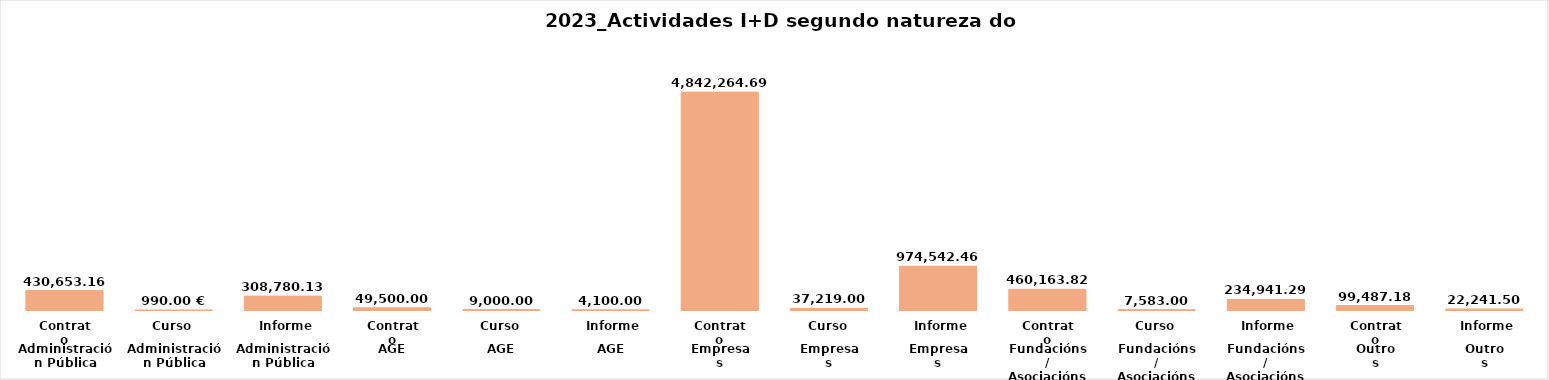
| Category | Series 0 |
|---|---|
| 0 | 430653.16 |
| 1 | 990 |
| 2 | 308780.13 |
| 3 | 49500 |
| 4 | 9000 |
| 5 | 4100 |
| 6 | 4842264.69 |
| 7 | 37219 |
| 8 | 974542.46 |
| 9 | 460163.82 |
| 10 | 7583 |
| 11 | 234941.29 |
| 12 | 99487.18 |
| 13 | 22241.5 |